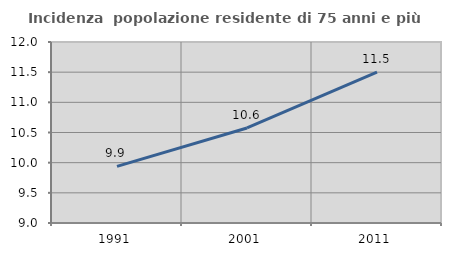
| Category | Incidenza  popolazione residente di 75 anni e più |
|---|---|
| 1991.0 | 9.938 |
| 2001.0 | 10.575 |
| 2011.0 | 11.499 |